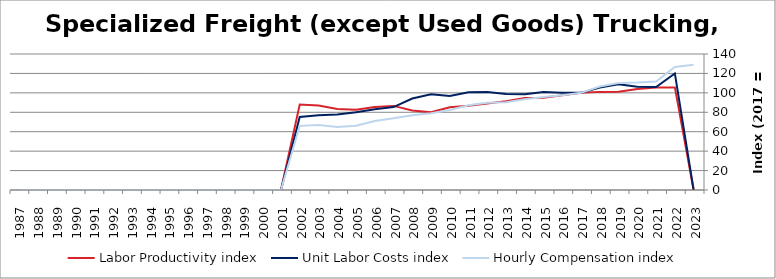
| Category | Labor Productivity index | Unit Labor Costs index | Hourly Compensation index |
|---|---|---|---|
| 2023.0 | 0 | 0 | 128.961 |
| 2022.0 | 105.584 | 120.027 | 126.73 |
| 2021.0 | 105.483 | 105.915 | 111.723 |
| 2020.0 | 104.042 | 106.298 | 110.595 |
| 2019.0 | 101.125 | 108.946 | 110.171 |
| 2018.0 | 101.011 | 105.474 | 106.541 |
| 2017.0 | 100 | 100 | 100 |
| 2016.0 | 97.563 | 100.014 | 97.577 |
| 2015.0 | 94.936 | 100.952 | 95.84 |
| 2014.0 | 94.641 | 98.675 | 93.387 |
| 2013.0 | 91.489 | 98.866 | 90.452 |
| 2012.0 | 89.123 | 100.783 | 89.821 |
| 2011.0 | 86.691 | 100.709 | 87.305 |
| 2010.0 | 85.14 | 96.714 | 82.343 |
| 2009.0 | 80.138 | 98.592 | 79.009 |
| 2008.0 | 81.829 | 94.136 | 77.031 |
| 2007.0 | 86.584 | 85.394 | 73.937 |
| 2006.0 | 85.477 | 83.043 | 70.983 |
| 2005.0 | 82.634 | 80.015 | 66.12 |
| 2004.0 | 83.434 | 77.617 | 64.759 |
| 2003.0 | 87.035 | 76.948 | 66.972 |
| 2002.0 | 87.937 | 75.095 | 66.037 |
| 2001.0 | 0 | 0 | 0 |
| 2000.0 | 0 | 0 | 0 |
| 1999.0 | 0 | 0 | 0 |
| 1998.0 | 0 | 0 | 0 |
| 1997.0 | 0 | 0 | 0 |
| 1996.0 | 0 | 0 | 0 |
| 1995.0 | 0 | 0 | 0 |
| 1994.0 | 0 | 0 | 0 |
| 1993.0 | 0 | 0 | 0 |
| 1992.0 | 0 | 0 | 0 |
| 1991.0 | 0 | 0 | 0 |
| 1990.0 | 0 | 0 | 0 |
| 1989.0 | 0 | 0 | 0 |
| 1988.0 | 0 | 0 | 0 |
| 1987.0 | 0 | 0 | 0 |